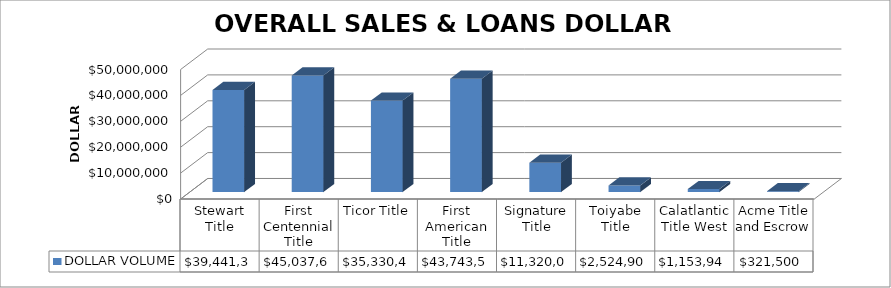
| Category | DOLLAR VOLUME |
|---|---|
| Stewart Title | 39441356.51 |
| First Centennial Title | 45037662 |
| Ticor Title | 35330465.48 |
| First American Title | 43743517.5 |
| Signature Title | 11320000 |
| Toiyabe Title | 2524900 |
| Calatlantic Title West | 1153946 |
| Acme Title and Escrow | 321500 |